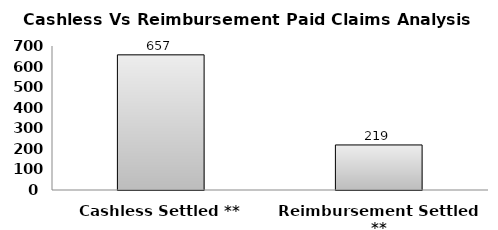
| Category | Series 0 |
|---|---|
| Cashless Settled ** | 657 |
| Reimbursement Settled  ** | 219 |